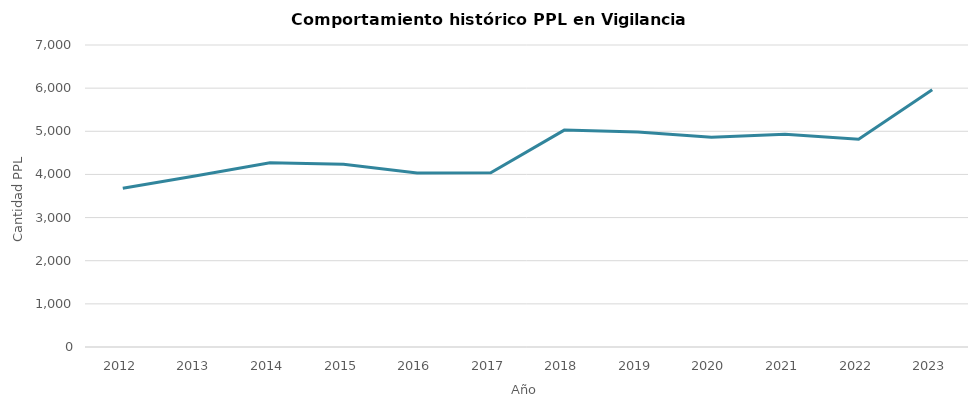
| Category | Promedio anual Vigilancia Electronica |
|---|---|
| 2012.0 | 3681.25 |
| 2013.0 | 3969.167 |
| 2014.0 | 4270.833 |
| 2015.0 | 4235.667 |
| 2016.0 | 4035.917 |
| 2017.0 | 4037.5 |
| 2018.0 | 5027.25 |
| 2019.0 | 4984.25 |
| 2020.0 | 4861 |
| 2021.0 | 4932.083 |
| 2022.0 | 4814.083 |
| 2023.0 | 5961.818 |